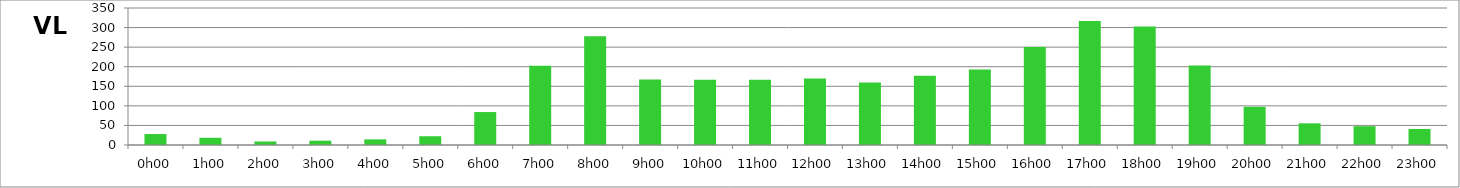
| Category | VL |
|---|---|
| 0.0 | 28 |
| 0.041666666666666664 | 18.4 |
| 0.08333333333333333 | 9 |
| 0.125 | 11 |
| 0.16666666666666666 | 14.4 |
| 0.20833333333333334 | 22.4 |
| 0.25 | 84.2 |
| 0.2916666666666667 | 202.6 |
| 0.3333333333333333 | 277.6 |
| 0.375 | 167.4 |
| 0.4166666666666667 | 166.8 |
| 0.4583333333333333 | 166.6 |
| 0.5 | 170 |
| 0.5416666666666666 | 159.8 |
| 0.5833333333333334 | 176.6 |
| 0.625 | 192.6 |
| 0.6666666666666666 | 250.6 |
| 0.7083333333333334 | 316.6 |
| 0.75 | 302.8 |
| 0.7916666666666666 | 203.4 |
| 0.8333333333333334 | 97.6 |
| 0.875 | 55.4 |
| 0.9166666666666666 | 48 |
| 0.9583333333333334 | 41 |